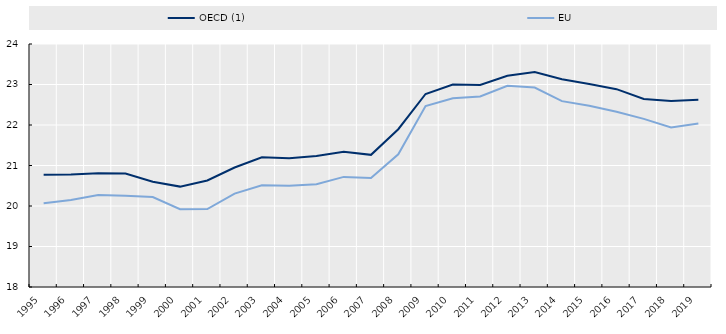
| Category | OECD (1) | EU |
|---|---|---|
| 1995 | 20.772 | 20.067 |
| 1996 | 20.775 | 20.148 |
| 1997 | 20.808 | 20.27 |
| 1998 | 20.804 | 20.252 |
| 1999 | 20.601 | 20.222 |
| 2000 | 20.479 | 19.922 |
| 2001 | 20.63 | 19.926 |
| 2002 | 20.951 | 20.307 |
| 2003 | 21.204 | 20.511 |
| 2004 | 21.177 | 20.5 |
| 2005 | 21.236 | 20.537 |
| 2006 | 21.336 | 20.719 |
| 2007 | 21.263 | 20.689 |
| 2008 | 21.896 | 21.278 |
| 2009 | 22.766 | 22.467 |
| 2010 | 23 | 22.659 |
| 2011 | 22.988 | 22.704 |
| 2012 | 23.214 | 22.967 |
| 2013 | 23.31 | 22.926 |
| 2014 | 23.132 | 22.589 |
| 2015 | 23.01 | 22.474 |
| 2016 | 22.885 | 22.326 |
| 2017 | 22.641 | 22.152 |
| 2018 | 22.593 | 21.941 |
| 2019 | 22.622 | 22.037 |